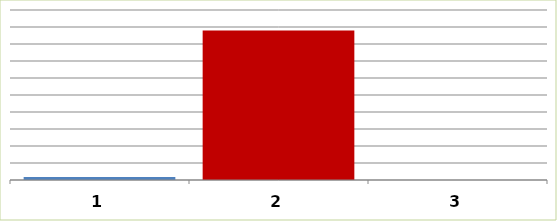
| Category | Series 0 |
|---|---|
| 0 | 180000 |
| 1 | 8790766 |
| 2 | 0 |